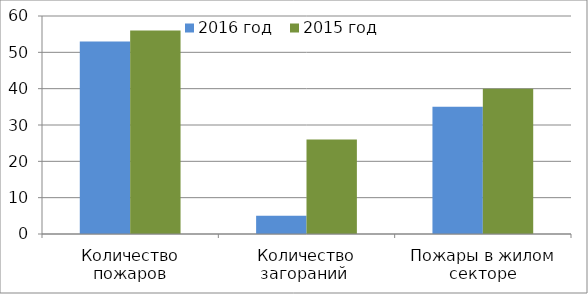
| Category | 2016 год | 2015 год |
|---|---|---|
| Количество пожаров | 53 | 56 |
| Количество загораний  | 5 | 26 |
| Пожары в жилом секторе | 35 | 40 |